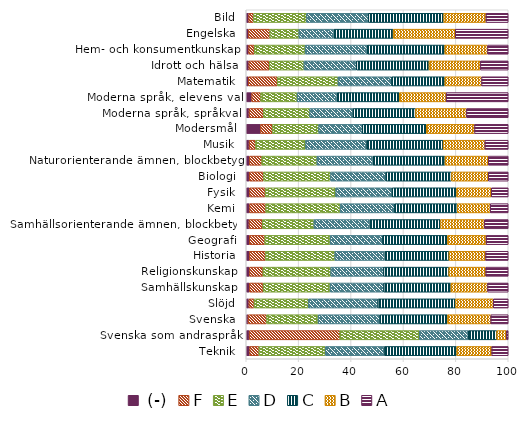
| Category |  (-) | F | E | D | C | B | A |
|---|---|---|---|---|---|---|---|
| Teknik | 1.271 | 3.578 | 25.298 | 22.491 | 27.664 | 13.399 | 6.298 |
| Svenska som andraspråk | 1.123 | 34.593 | 30.322 | 18.69 | 10.891 | 3.656 | 0.725 |
| Svenska | 0.699 | 7.053 | 19.678 | 23.58 | 25.775 | 16.553 | 6.662 |
| Slöjd | 1.022 | 1.974 | 20.722 | 26.537 | 29.638 | 14.381 | 5.725 |
| Samhällskunskap | 1.175 | 5.284 | 25.544 | 20.501 | 25.609 | 13.98 | 7.906 |
| Religionskunskap | 1.21 | 5.173 | 25.88 | 20.12 | 24.946 | 14.087 | 8.584 |
| Historia | 1.185 | 6.14 | 26.472 | 19.108 | 24.472 | 13.97 | 8.653 |
| Geografi | 1.15 | 5.909 | 24.973 | 20.037 | 24.694 | 14.797 | 8.441 |
| Samhällsorienterande ämnen, blockbetyg | 1.071 | 5.074 | 19.68 | 21.32 | 27.011 | 16.708 | 9.136 |
| Kemi | 1.25 | 6.172 | 28.42 | 20.76 | 23.928 | 12.594 | 6.876 |
| Fysik | 1.214 | 6.001 | 26.92 | 21.505 | 24.602 | 13.267 | 6.491 |
| Biologi | 1.13 | 5.468 | 25.569 | 21.148 | 25.056 | 13.998 | 7.63 |
| Naturorienterande ämnen, blockbetyg | 1.168 | 4.74 | 21.064 | 21.384 | 27.491 | 16.522 | 7.63 |
| Musik | 1.098 | 2.461 | 19.075 | 23.234 | 29.297 | 15.912 | 8.924 |
| Modersmål | 5.426 | 4.574 | 17.63 | 16.677 | 24.398 | 18.424 | 12.87 |
| Moderna språk, språkval | 1.084 | 5.481 | 17.658 | 16.529 | 23.887 | 19.405 | 15.957 |
| Moderna språk, elevens val | 2.062 | 3.436 | 13.918 | 15.292 | 23.711 | 17.869 | 23.711 |
| Matematik | 0.777 | 11.068 | 23.172 | 20.505 | 20.256 | 14.04 | 10.182 |
| Idrott och hälsa | 0.993 | 7.781 | 13.235 | 20.033 | 27.709 | 19.603 | 10.645 |
| Hem- och konsumentkunskap | 0.922 | 2.154 | 19.386 | 23.717 | 29.569 | 16.335 | 7.918 |
| Engelska | 0.805 | 8.192 | 11.083 | 13.372 | 22.612 | 23.707 | 20.228 |
| Bild | 0.93 | 1.822 | 20.252 | 23.604 | 28.752 | 16.137 | 8.503 |